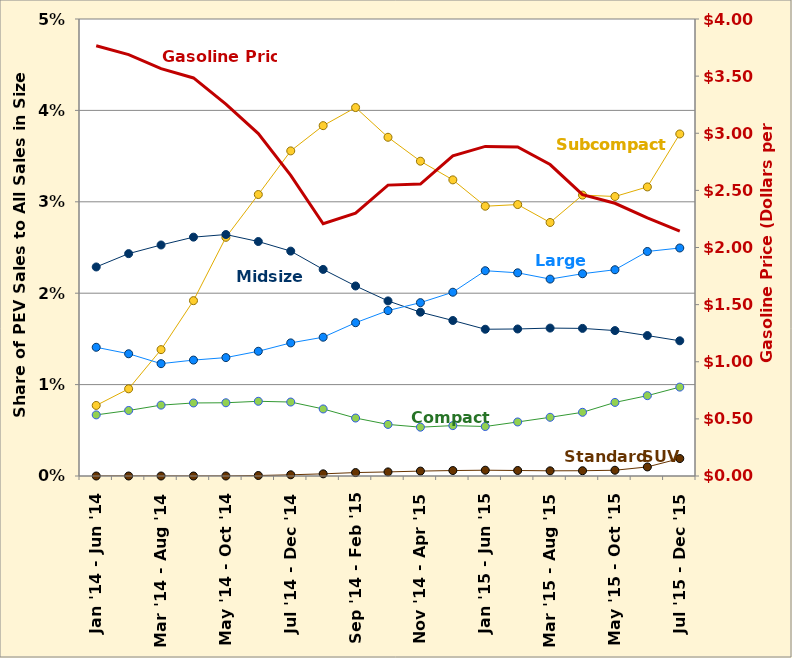
| Category | Subcompact EV | Compact EV | Midsize EV | Large EV | Standard SUV 4WD EV |
|---|---|---|---|---|---|
| Jan '14 - Jun '14 | 0.008 | 0.007 | 0.023 | 0.014 | 0 |
| Feb '14 - Jul '14 | 0.01 | 0.007 | 0.024 | 0.013 | 0 |
| Mar '14 - Aug '14 | 0.014 | 0.008 | 0.025 | 0.012 | 0 |
| Apr '14 - Sep '14 | 0.019 | 0.008 | 0.026 | 0.013 | 0 |
| May '14 - Oct '14 | 0.026 | 0.008 | 0.026 | 0.013 | 0 |
| Jun '14 - Nov '14 | 0.031 | 0.008 | 0.026 | 0.014 | 0 |
| Jul '14 - Dec '14 | 0.036 | 0.008 | 0.025 | 0.015 | 0 |
| Aug '14 - Jan '15 | 0.038 | 0.007 | 0.023 | 0.015 | 0 |
| Sep '14 - Feb '15 | 0.04 | 0.006 | 0.021 | 0.017 | 0 |
| Oct '14 - Mar '15 | 0.037 | 0.006 | 0.019 | 0.018 | 0 |
| Nov '14 - Apr '15 | 0.034 | 0.005 | 0.018 | 0.019 | 0.001 |
| Dec '14 - May '15 | 0.032 | 0.006 | 0.017 | 0.02 | 0.001 |
| Jan '15 - Jun '15 | 0.03 | 0.005 | 0.016 | 0.022 | 0.001 |
| Feb '15 - Jul '15 | 0.03 | 0.006 | 0.016 | 0.022 | 0.001 |
| Mar '15 - Aug '15 | 0.028 | 0.006 | 0.016 | 0.022 | 0.001 |
| Apr '15 - Sep '15 | 0.031 | 0.007 | 0.016 | 0.022 | 0.001 |
| May '15 - Oct '15 | 0.031 | 0.008 | 0.016 | 0.023 | 0.001 |
| Jun '15 - Nov '15 | 0.032 | 0.009 | 0.015 | 0.025 | 0.001 |
| Jul '15 - Dec '15 | 0.037 | 0.01 | 0.015 | 0.025 | 0.002 |